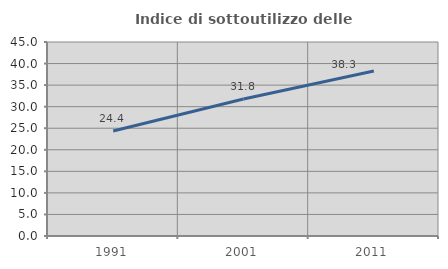
| Category | Indice di sottoutilizzo delle abitazioni  |
|---|---|
| 1991.0 | 24.37 |
| 2001.0 | 31.765 |
| 2011.0 | 38.267 |